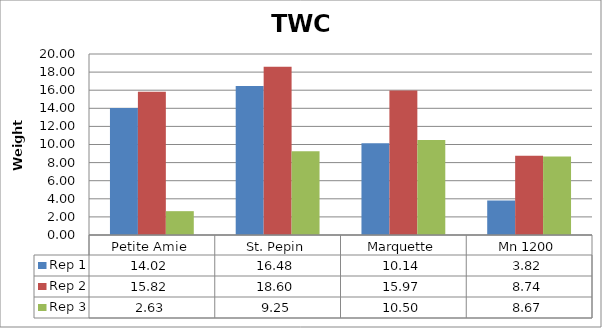
| Category | Rep 1 | Rep 2 | Rep 3 |
|---|---|---|---|
| 0 | 14.022 | 15.822 | 2.633 |
| 1 | 16.478 | 18.6 | 9.246 |
| 2 | 10.144 | 15.967 | 10.5 |
| 3 | 3.822 | 8.744 | 8.667 |